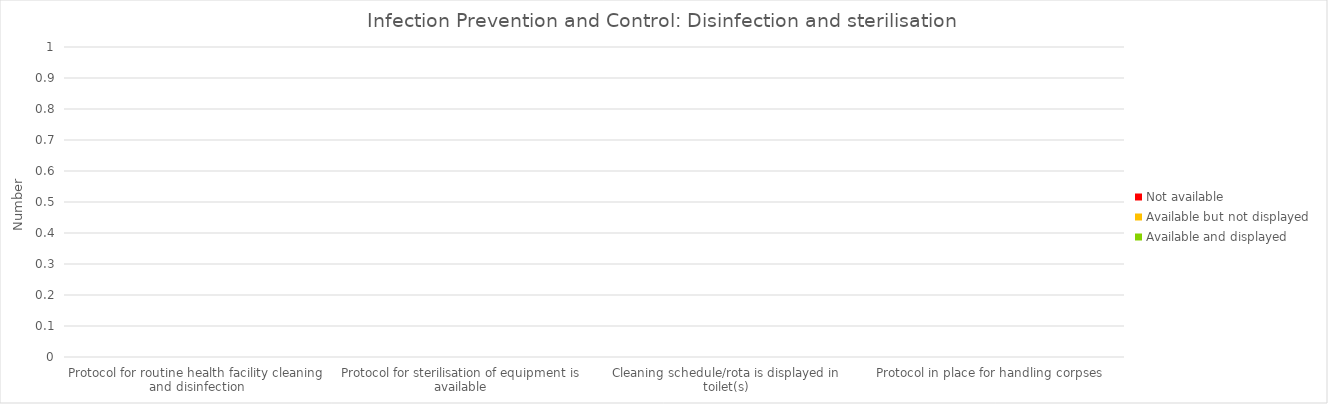
| Category | Available and displayed | Available but not displayed | Not available |
|---|---|---|---|
| Protocol for routine health facility cleaning and disinfection | 0 | 0 | 0 |
| Protocol for sterilisation of equipment is available | 0 | 0 | 0 |
| Cleaning schedule/rota is displayed in toilet(s) | 0 | 0 | 0 |
| Protocol in place for handling corpses | 0 | 0 | 0 |